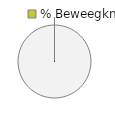
| Category | 3 - Beweegknap |
|---|---|
| 0 | 0 |
| 1 | 1 |